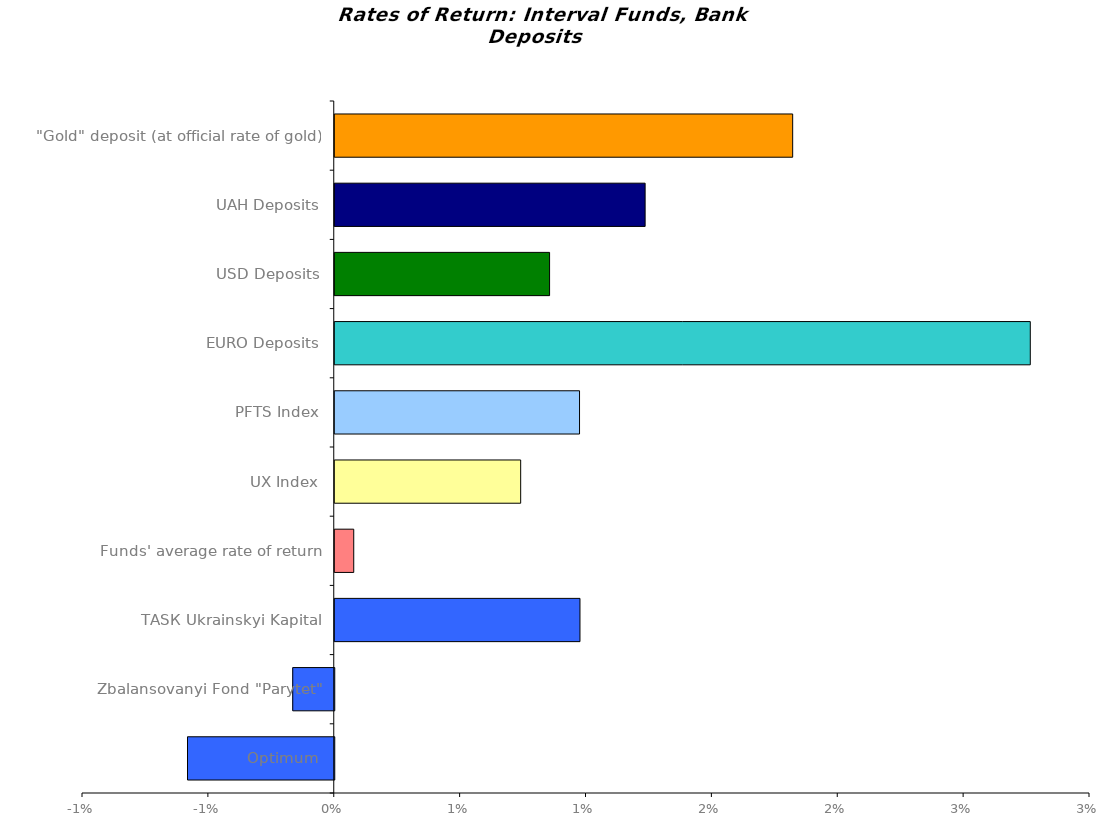
| Category | Series 0 |
|---|---|
| Optimum | -0.006 |
| Zbalansovanyi Fond "Parytet" | -0.002 |
| ТАSК Ukrainskyi Kapital | 0.01 |
| Funds' average rate of return | 0.001 |
| UX Index | 0.007 |
| PFTS Index | 0.01 |
| EURO Deposits | 0.028 |
| USD Deposits | 0.009 |
| UAH Deposits | 0.012 |
| "Gold" deposit (at official rate of gold) | 0.018 |